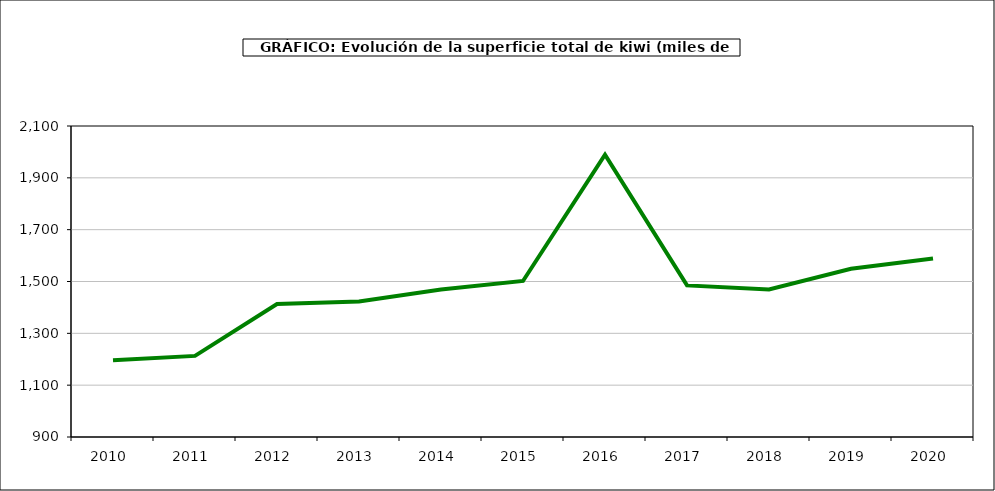
| Category | superficie kiwi |
|---|---|
| 2010.0 | 1196 |
| 2011.0 | 1213 |
| 2012.0 | 1413 |
| 2013.0 | 1423 |
| 2014.0 | 1469 |
| 2015.0 | 1502 |
| 2016.0 | 1989 |
| 2017.0 | 1485 |
| 2018.0 | 1469 |
| 2019.0 | 1549 |
| 2020.0 | 1589 |